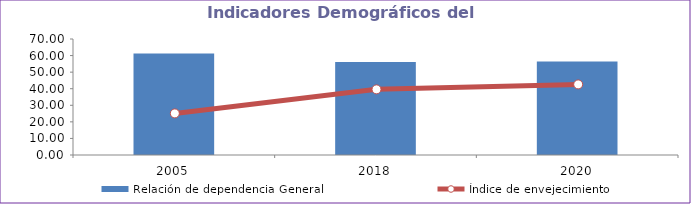
| Category | Relación de dependencia General |
|---|---|
| 2005.0 | 61.237 |
| 2018.0 | 56.113 |
| 2020.0 | 56.397 |